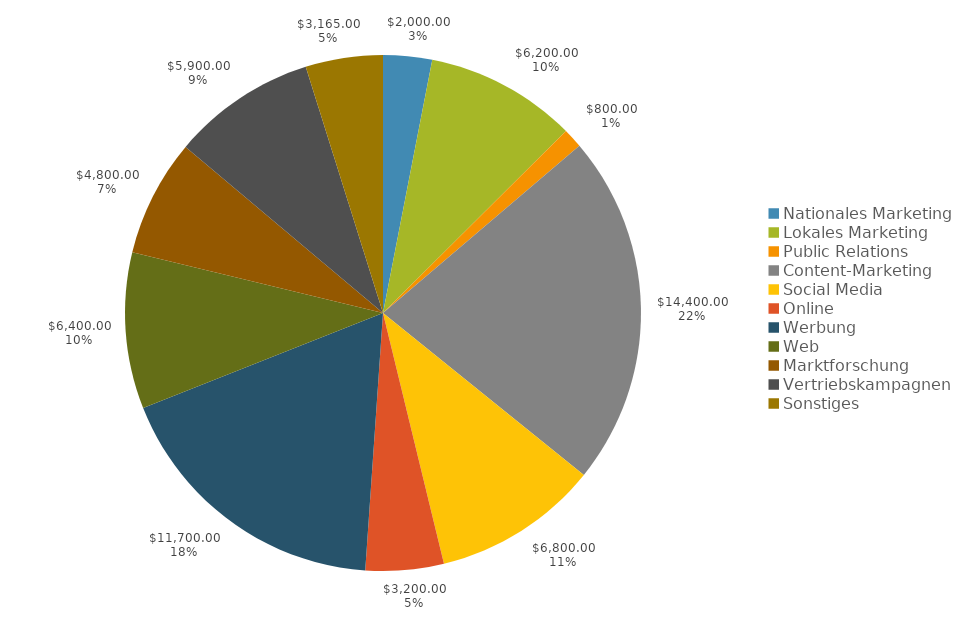
| Category | Series 0 | Series 1 |
|---|---|---|
| Nationales Marketing | 2000 | 0.031 |
| Lokales Marketing | 6200 | 0.095 |
| Public Relations | 800 | 0.012 |
| Content-Marketing | 14400 | 0.22 |
| Social Media | 6800 | 0.104 |
| Online | 3200 | 0.049 |
| Werbung | 11700 | 0.179 |
| Web | 6400 | 0.098 |
| Marktforschung | 4800 | 0.073 |
| Vertriebskampagnen | 5900 | 0.09 |
| Sonstiges | 3165 | 0.048 |